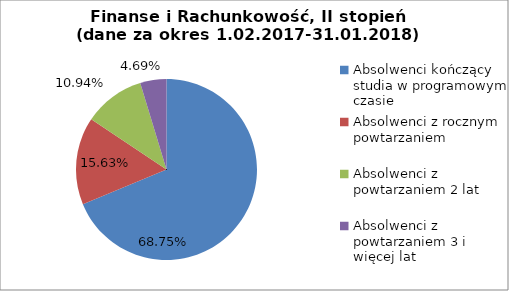
| Category | Series 0 |
|---|---|
| Absolwenci kończący studia w programowym czasie | 68.75 |
| Absolwenci z rocznym powtarzaniem | 15.625 |
| Absolwenci z powtarzaniem 2 lat | 10.938 |
| Absolwenci z powtarzaniem 3 i więcej lat | 4.688 |